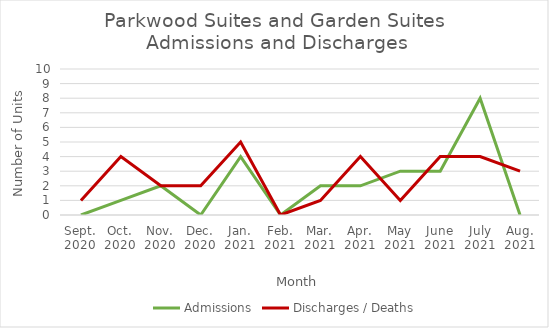
| Category | Admissions | Discharges / Deaths |
|---|---|---|
| Sept.
2020 | 0 | 1 |
| Oct.
2020 | 1 | 4 |
| Nov.
2020 | 2 | 2 |
| Dec.
2020 | 0 | 2 |
| Jan.
2021 | 4 | 5 |
| Feb.
2021 | 0 | 0 |
| Mar.
2021 | 2 | 1 |
| Apr.
2021 | 2 | 4 |
| May
2021 | 3 | 1 |
| June
2021 | 3 | 4 |
| July
2021 | 8 | 4 |
| Aug.
2021 | 0 | 3 |